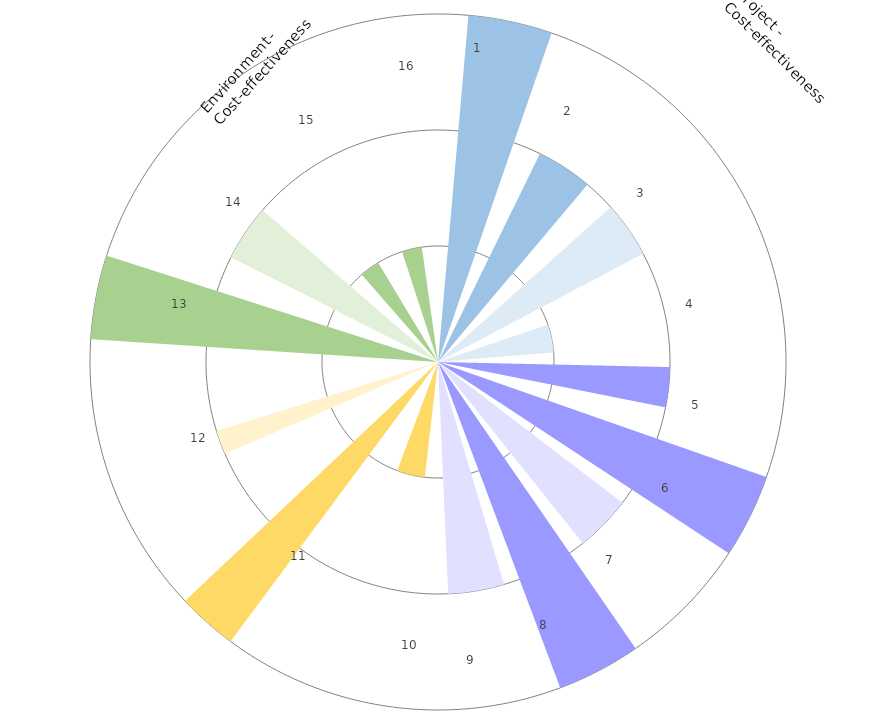
| Category | Sector size |
|---|---|
| Housing affordability | 22.5 |
| Development yield | 22.5 |
| Public infrastructure delivery | 22.5 |
| Health and wellness affordability | 22.5 |
| Avoided earthworking costs | 18 |
| Avoided hard infrastructure/ pipes costs | 18 |
| Avoided impervious area costs | 18 |
| Avoided landscaping costs | 18 |
| Avoided property operation costs | 18 |
| Avoided costs of future proofing (climate change; resilience) | 30 |
| Avoided property remediation and storm damage costs (flooding) | 30 |
| Avoided environmental remediation costs | 30 |
| Terrestrial habitat quality cost effectivenss | 22.5 |
| Aquatic habitat quality cost effectivenss | 22.5 |
| Hydrology cost effectiveness | 22.5 |
| Water quality cost effectiveness | 22.5 |